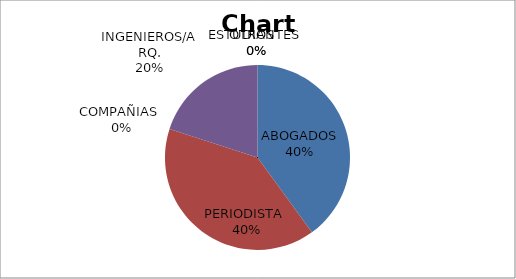
| Category | Series 0 |
|---|---|
| ABOGADOS | 2 |
| PERIODISTA  | 2 |
| COMPAÑIAS  | 0 |
| INGENIEROS/ARQ. | 1 |
| ESTUDIANTES  | 0 |
| OTROS   | 0 |